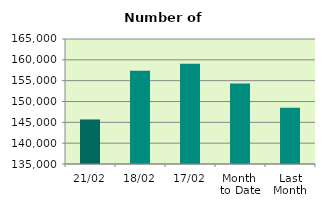
| Category | Series 0 |
|---|---|
| 21/02 | 145690 |
| 18/02 | 157372 |
| 17/02 | 159062 |
| Month 
to Date | 154337.467 |
| Last
Month | 148479.905 |